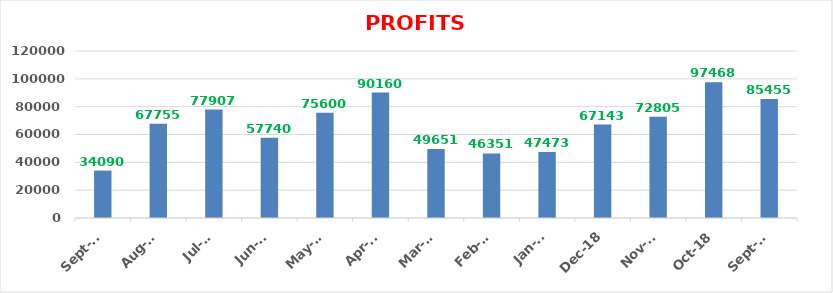
| Category | PROFITS (Rs.) |
|---|---|
| 2019-09-01 | 34090 |
| 2019-08-01 | 67755 |
| 2019-07-01 | 77907 |
| 2019-06-01 | 57740 |
| 2019-05-01 | 75600 |
| 2019-04-01 | 90160 |
| 2019-03-01 | 49651 |
| 2019-02-01 | 46351 |
| 2019-01-01 | 47473 |
| 2018-12-01 | 67143 |
| 2018-11-01 | 72805 |
| 2018-10-01 | 97468 |
| 2018-09-01 | 85455 |